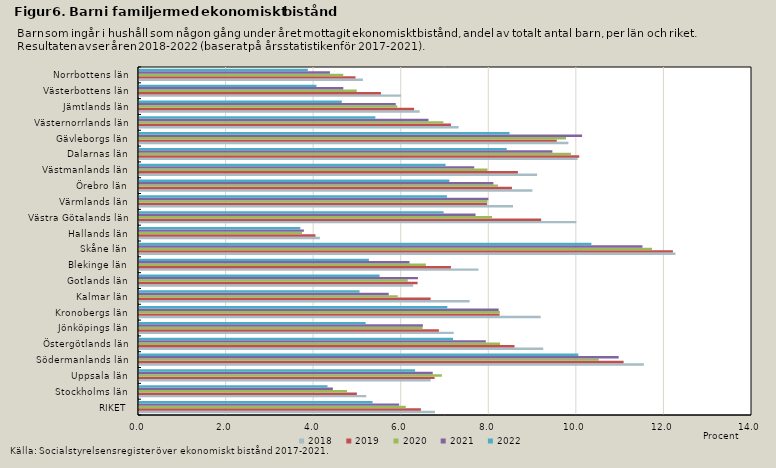
| Category | 2018 | 2019 | 2020 | 2021 | 2022 |
|---|---|---|---|---|---|
| RIKET | 6.758 | 6.439 | 6.092 | 5.941 | 5.334 |
| Stockholms län | 5.19 | 4.976 | 4.75 | 4.428 | 4.304 |
| Uppsala län | 6.661 | 6.751 | 6.917 | 6.707 | 6.306 |
| Södermanlands län | 11.53 | 11.068 | 10.501 | 10.955 | 10.033 |
| Östergötlands län | 9.231 | 8.576 | 8.247 | 7.92 | 7.172 |
| Jönköpings län | 7.187 | 6.849 | 6.478 | 6.483 | 5.177 |
| Kronobergs län | 9.174 | 8.234 | 8.242 | 8.214 | 7.041 |
| Kalmar län | 7.551 | 6.66 | 5.91 | 5.703 | 5.037 |
| Gotlands län | 6.26 | 6.363 | 6.137 | 6.371 | 5.495 |
| Blekinge län | 7.753 | 7.124 | 6.551 | 6.178 | 5.251 |
| Skåne län | 12.252 | 12.194 | 11.716 | 11.498 | 10.332 |
| Hallands län | 4.131 | 4.031 | 3.722 | 3.765 | 3.684 |
| Västra Götalands län | 9.987 | 9.185 | 8.064 | 7.686 | 6.957 |
| Värmlands län | 8.543 | 7.951 | 7.958 | 7.979 | 7.033 |
| Örebro län | 8.984 | 8.518 | 8.197 | 8.093 | 7.089 |
| Västmanlands län | 9.093 | 8.654 | 7.959 | 7.656 | 7.002 |
| Dalarnas län | 10.017 | 10.054 | 9.865 | 9.44 | 8.399 |
| Gävleborgs län | 9.806 | 9.541 | 9.753 | 10.119 | 8.463 |
| Västernorrlands län | 7.299 | 7.124 | 6.952 | 6.611 | 5.398 |
| Jämtlands län | 6.411 | 6.283 | 5.897 | 5.864 | 4.631 |
| Västerbottens län | 5.986 | 5.526 | 4.973 | 4.666 | 4.053 |
| Norrbottens län | 5.114 | 4.944 | 4.665 | 4.361 | 3.855 |